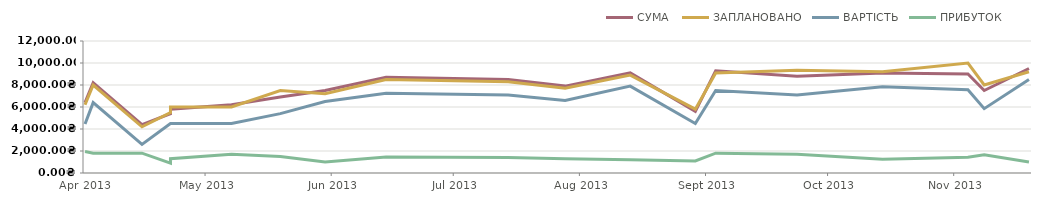
| Category | СУМА | ЗАПЛАНОВАНО | ВАРТІСТЬ | ПРИБУТОК |
|---|---|---|---|---|
| 2013-04-23 | 6400 | 6200 | 4450 | 1950 |
| 2013-04-25 | 8200 | 8000 | 6400 | 1800 |
| 2013-05-07 | 4400 | 4200 | 2600 | 1800 |
| 2013-05-14 | 5400 | 5500 | 4500 | 900 |
| 2013-05-14 | 5800 | 6000 | 4500 | 1300 |
| 2013-05-29 | 6200 | 6000 | 4500 | 1700 |
| 2013-06-10 | 6900 | 7500 | 5400 | 1500 |
| 2013-06-21 | 7500 | 7200 | 6500 | 1000 |
| 2013-07-06 | 8700 | 8500 | 7250 | 1450 |
| 2013-08-05 | 8500 | 8300 | 7100 | 1400 |
| 2013-08-19 | 7900 | 7700 | 6600 | 1300 |
| 2013-09-04 | 9100 | 8900 | 7900 | 1200 |
| 2013-09-20 | 5600 | 5800 | 4500 | 1100 |
| 2013-09-25 | 9300 | 9100 | 7500 | 1800 |
| 2013-10-15 | 8800 | 9350 | 7100 | 1700 |
| 2013-11-05 | 9100 | 9200 | 7850 | 1250 |
| 2013-11-26 | 9000 | 10000 | 7575 | 1425 |
| 2013-11-30 | 7500 | 8000 | 5850 | 1650 |
| 2013-12-11 | 9500 | 9200 | 8500 | 1000 |